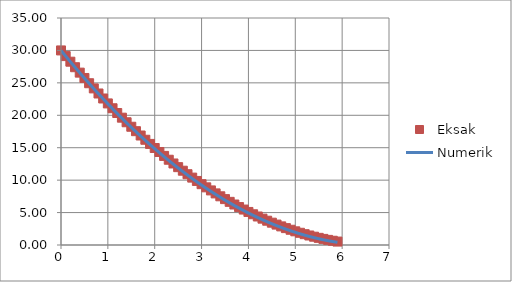
| Category | Eksak |
|---|---|
| 0.0 | 30 |
| 0.1 | 29.125 |
| 0.2 | 28.262 |
| 0.30000000000000004 | 27.413 |
| 0.4 | 26.576 |
| 0.5 | 25.753 |
| 0.6 | 24.942 |
| 0.7 | 24.145 |
| 0.7999999999999999 | 23.36 |
| 0.8999999999999999 | 22.589 |
| 0.9999999999999999 | 21.83 |
| 1.0999999999999999 | 21.084 |
| 1.2 | 20.351 |
| 1.3 | 19.632 |
| 1.4000000000000001 | 18.925 |
| 1.5000000000000002 | 18.231 |
| 1.6000000000000003 | 17.55 |
| 1.7000000000000004 | 16.882 |
| 1.8000000000000005 | 16.227 |
| 1.9000000000000006 | 15.585 |
| 2.0000000000000004 | 14.956 |
| 2.1000000000000005 | 14.34 |
| 2.2000000000000006 | 13.736 |
| 2.3000000000000007 | 13.146 |
| 2.400000000000001 | 12.569 |
| 2.500000000000001 | 12.005 |
| 2.600000000000001 | 11.453 |
| 2.700000000000001 | 10.915 |
| 2.800000000000001 | 10.389 |
| 2.9000000000000012 | 9.877 |
| 3.0000000000000013 | 9.378 |
| 3.1000000000000014 | 8.891 |
| 3.2000000000000015 | 8.417 |
| 3.3000000000000016 | 7.957 |
| 3.4000000000000017 | 7.509 |
| 3.5000000000000018 | 7.074 |
| 3.600000000000002 | 6.653 |
| 3.700000000000002 | 6.244 |
| 3.800000000000002 | 5.848 |
| 3.900000000000002 | 5.465 |
| 4.000000000000002 | 5.095 |
| 4.100000000000001 | 4.738 |
| 4.200000000000001 | 4.394 |
| 4.300000000000001 | 4.063 |
| 4.4 | 3.745 |
| 4.5 | 3.44 |
| 4.6 | 3.148 |
| 4.699999999999999 | 2.869 |
| 4.799999999999999 | 2.603 |
| 4.899999999999999 | 2.349 |
| 4.999999999999998 | 2.109 |
| 5.099999999999998 | 1.882 |
| 5.1999999999999975 | 1.667 |
| 5.299999999999997 | 1.466 |
| 5.399999999999997 | 1.278 |
| 5.4999999999999964 | 1.102 |
| 5.599999999999996 | 0.94 |
| 5.699999999999996 | 0.79 |
| 5.799999999999995 | 0.653 |
| 5.899999999999995 | 0.53 |